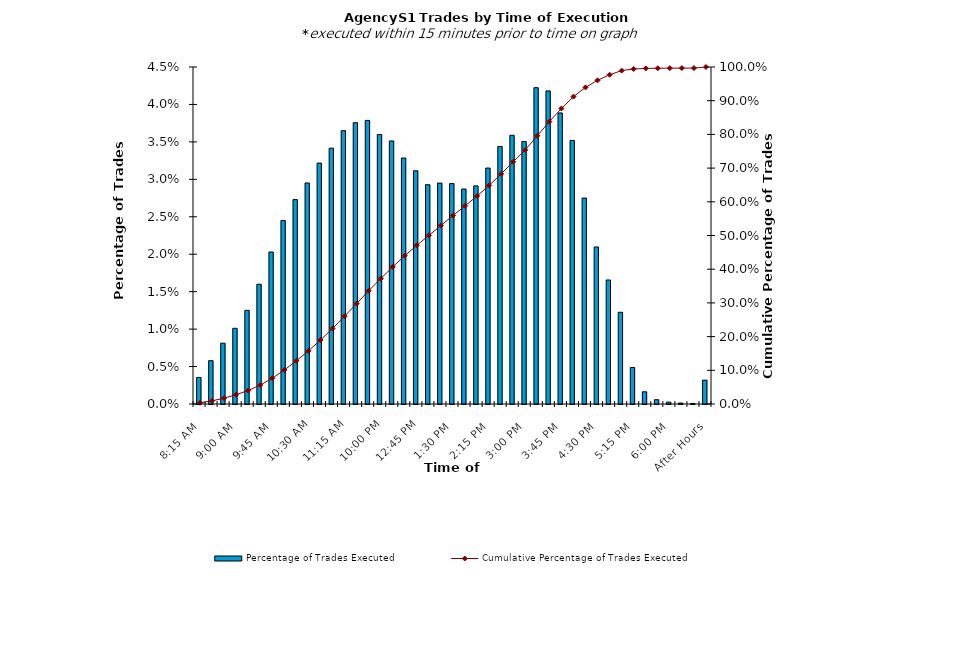
| Category | Percentage of Trades Executed |
|---|---|
| 8:15 AM | 0.004 |
| 8:30 AM | 0.006 |
| 8:45 AM | 0.008 |
| 9:00 AM | 0.01 |
| 9:15 AM | 0.013 |
| 9:30 AM | 0.016 |
| 9:45 AM | 0.02 |
| 10:00 AM | 0.025 |
| 10:15 AM | 0.027 |
| 10:30 AM | 0.03 |
| 10:45 AM | 0.032 |
| 11:00 AM | 0.034 |
| 11:15 AM | 0.036 |
| 11:30 AM | 0.038 |
| 11:45 AM | 0.038 |
| 12:00 PM | 0.036 |
| 12:15 PM | 0.035 |
| 12:30 PM | 0.033 |
| 12:45 PM | 0.031 |
| 1:00 PM | 0.029 |
| 1:15 PM | 0.03 |
| 1:30 PM | 0.029 |
| 1:45 PM | 0.029 |
| 2:00 PM | 0.029 |
| 2:15 PM | 0.032 |
| 2:30 PM | 0.034 |
| 2:45 PM | 0.036 |
| 3:00 PM | 0.035 |
| 3:15 PM | 0.042 |
| 3:30 PM | 0.042 |
| 3:45 PM | 0.039 |
| 4:00 PM | 0.035 |
| 4:15 PM | 0.027 |
| 4:30 PM | 0.021 |
| 4:45 PM | 0.017 |
| 5:00 PM | 0.012 |
| 5:15 PM | 0.005 |
| 5:30 PM | 0.002 |
| 5:45 PM | 0.001 |
| 6:00 PM | 0 |
| 6:15 PM | 0 |
| 6:30 PM | 0 |
| After Hours | 0.003 |